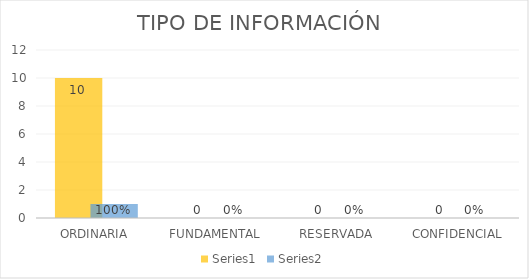
| Category | Series 3 | Series 4 |
|---|---|---|
| ORDINARIA | 10 | 1 |
| FUNDAMENTAL | 0 | 0 |
| RESERVADA | 0 | 0 |
| CONFIDENCIAL | 0 | 0 |